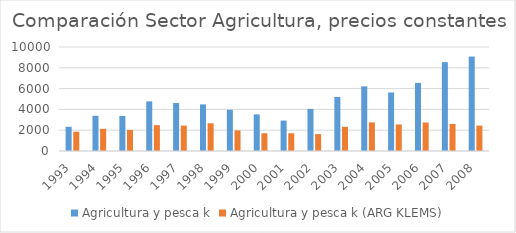
| Category | Agricultura y pesca k | Agricultura y pesca k (ARG KLEMS) |
|---|---|---|
| 1993.0 | 2330.016 | 1853.459 |
| 1994.0 | 3385.998 | 2132.283 |
| 1995.0 | 3373.666 | 2024.783 |
| 1996.0 | 4769.607 | 2485.614 |
| 1997.0 | 4615.667 | 2441.516 |
| 1998.0 | 4479.545 | 2666.184 |
| 1999.0 | 3963.135 | 1983.186 |
| 2000.0 | 3520.403 | 1706.348 |
| 2001.0 | 2925.379 | 1707.034 |
| 2002.0 | 4047.912 | 1626.799 |
| 2003.0 | 5190.845 | 2326.601 |
| 2004.0 | 6216.672 | 2751.509 |
| 2005.0 | 5627.644 | 2552.42 |
| 2006.0 | 6549.397 | 2742.643 |
| 2007.0 | 8546.74 | 2602.334 |
| 2008.0 | 9081.454 | 2441.347 |